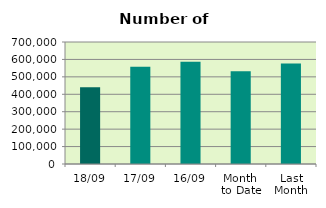
| Category | Series 0 |
|---|---|
| 18/09 | 440278 |
| 17/09 | 558354 |
| 16/09 | 587338 |
| Month 
to Date | 531650.308 |
| Last
Month | 576518.909 |